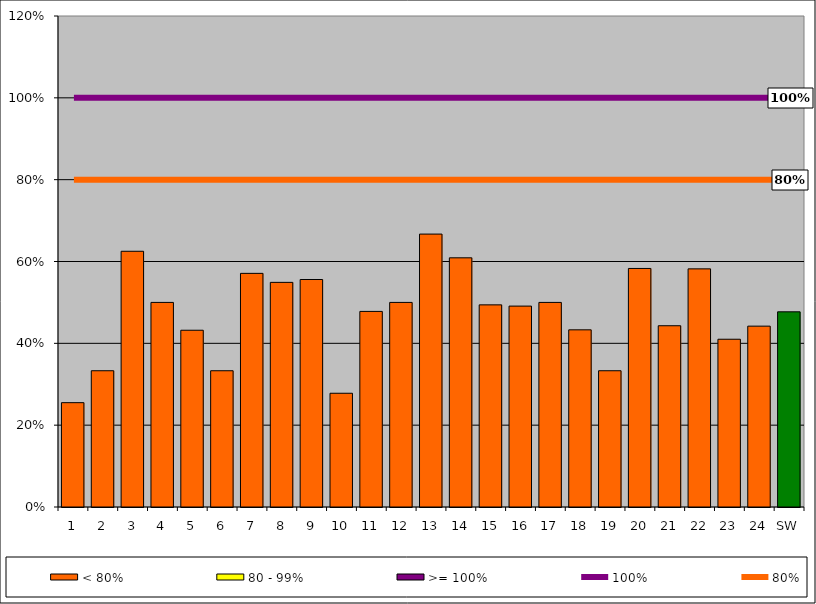
| Category | < 80% | 80 - 99% | >= 100% |
|---|---|---|---|
| 1 | 0.255 | 0 | 0 |
| 2 | 0.333 | 0 | 0 |
| 3 | 0.625 | 0 | 0 |
| 4 | 0.5 | 0 | 0 |
| 5 | 0.432 | 0 | 0 |
| 6 | 0.333 | 0 | 0 |
| 7 | 0.571 | 0 | 0 |
| 8 | 0.549 | 0 | 0 |
| 9 | 0.556 | 0 | 0 |
| 10 | 0.278 | 0 | 0 |
| 11 | 0.478 | 0 | 0 |
| 12 | 0.5 | 0 | 0 |
| 13 | 0.667 | 0 | 0 |
| 14 | 0.609 | 0 | 0 |
| 15 | 0.494 | 0 | 0 |
| 16 | 0.491 | 0 | 0 |
| 17 | 0.5 | 0 | 0 |
| 18 | 0.433 | 0 | 0 |
| 19 | 0.333 | 0 | 0 |
| 20 | 0.583 | 0 | 0 |
| 21 | 0.443 | 0 | 0 |
| 22 | 0.582 | 0 | 0 |
| 23 | 0.41 | 0 | 0 |
| 24 | 0.442 | 0 | 0 |
| SW | 0.477 | 0 | 0 |